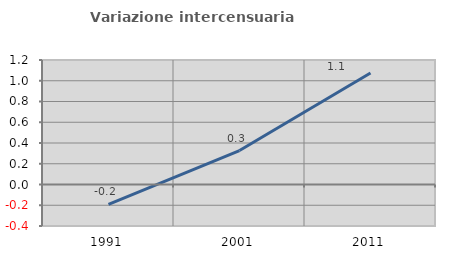
| Category | Variazione intercensuaria annua |
|---|---|
| 1991.0 | -0.192 |
| 2001.0 | 0.327 |
| 2011.0 | 1.074 |